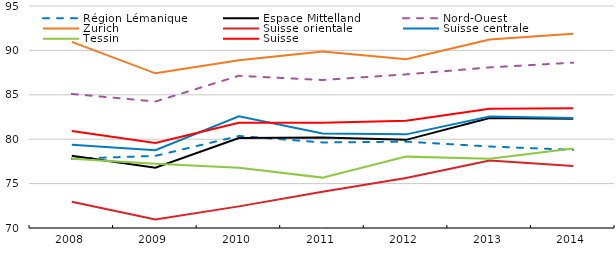
| Category | Région Lémanique | Espace Mittelland | Nord-Ouest | Zurich | Suisse orientale | Suisse centrale | Tessin | Suisse |
|---|---|---|---|---|---|---|---|---|
| 2008.0 | 77.801 | 78.142 | 85.1 | 90.961 | 72.953 | 79.368 | 77.805 | 80.927 |
| 2009.0 | 78.122 | 76.799 | 84.242 | 87.417 | 70.949 | 78.751 | 77.245 | 79.574 |
| 2010.0 | 80.361 | 80.138 | 87.141 | 88.882 | 72.435 | 82.587 | 76.784 | 81.843 |
| 2011.0 | 79.635 | 80.197 | 86.666 | 89.876 | 74.082 | 80.648 | 75.674 | 81.853 |
| 2012.0 | 79.725 | 79.925 | 87.303 | 89.011 | 75.636 | 80.544 | 78.037 | 82.078 |
| 2013.0 | 79.178 | 82.381 | 88.086 | 91.231 | 77.602 | 82.561 | 77.787 | 83.438 |
| 2014.0 | 78.8 | 82.314 | 88.62 | 91.874 | 76.98 | 82.376 | 78.949 | 83.472 |